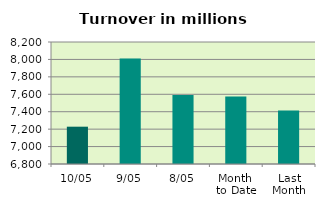
| Category | Series 0 |
|---|---|
| 10/05 | 7228.17 |
| 9/05 | 8011.878 |
| 8/05 | 7591.429 |
| Month 
to Date | 7573.689 |
| Last
Month | 7412.755 |